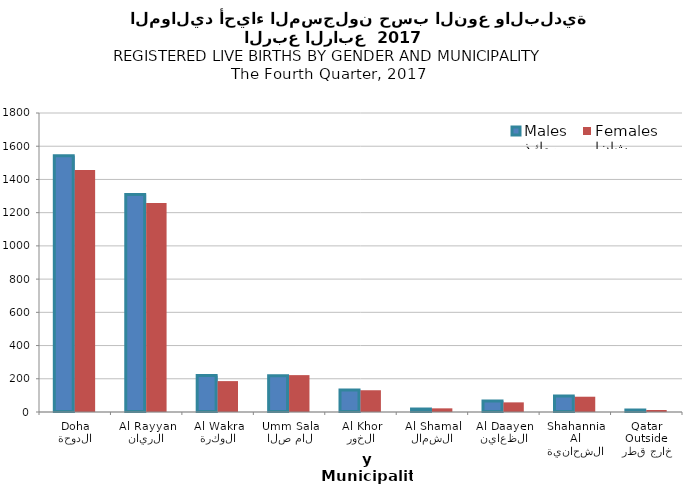
| Category | ذكور
Males | إناث
Females |
|---|---|---|
| الدوحة
Doha | 1543 | 1457 |
| الريان
Al Rayyan | 1309 | 1258 |
| الوكرة
Al Wakra | 219 | 186 |
| ام صلال
Umm Salal | 218 | 222 |
| الخور
Al Khor | 133 | 131 |
| الشمال
Al Shamal | 18 | 22 |
| الظعاين
Al Daayen | 66 | 58 |
| الشحانية
Al Shahannia | 96 | 92 |
| خارج قطر
Outside Qatar | 12 | 12 |